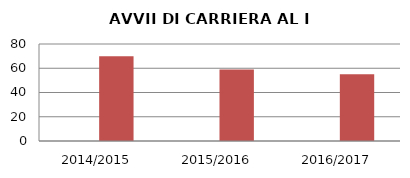
| Category | ANNO | NUMERO |
|---|---|---|
| 2014/2015 | 0 | 70 |
| 2015/2016 | 0 | 59 |
| 2016/2017 | 0 | 55 |